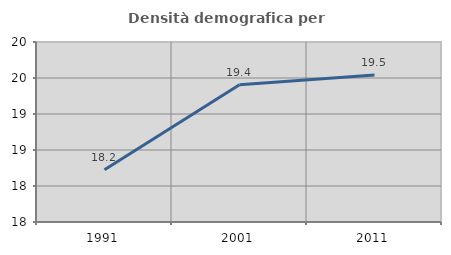
| Category | Densità demografica |
|---|---|
| 1991.0 | 18.225 |
| 2001.0 | 19.406 |
| 2011.0 | 19.542 |